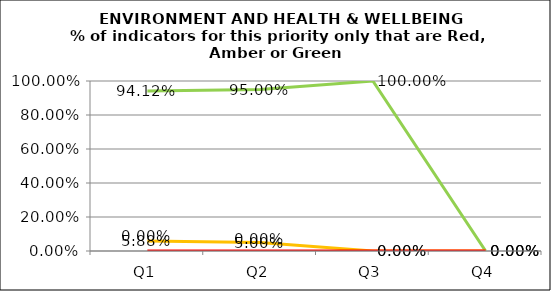
| Category | Green | Amber | Red |
|---|---|---|---|
| Q1 | 0.941 | 0.059 | 0 |
| Q2 | 0.95 | 0.05 | 0 |
| Q3 | 1 | 0 | 0 |
| Q4 | 0 | 0 | 0 |